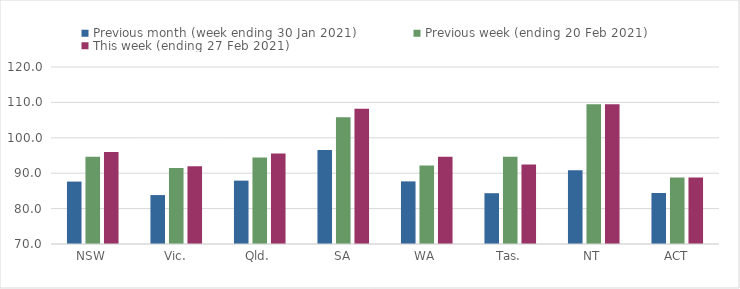
| Category | Previous month (week ending 30 Jan 2021) | Previous week (ending 20 Feb 2021) | This week (ending 27 Feb 2021) |
|---|---|---|---|
| NSW | 87.63 | 94.66 | 96.01 |
| Vic. | 83.82 | 91.46 | 91.97 |
| Qld. | 87.9 | 94.46 | 95.55 |
| SA | 96.56 | 105.84 | 108.21 |
| WA | 87.69 | 92.21 | 94.65 |
| Tas. | 84.35 | 94.64 | 92.46 |
| NT | 90.8 | 109.47 | 109.47 |
| ACT | 84.4 | 88.77 | 88.77 |